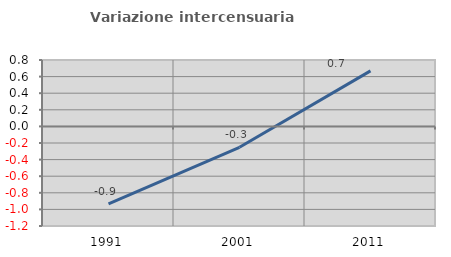
| Category | Variazione intercensuaria annua |
|---|---|
| 1991.0 | -0.934 |
| 2001.0 | -0.252 |
| 2011.0 | 0.668 |